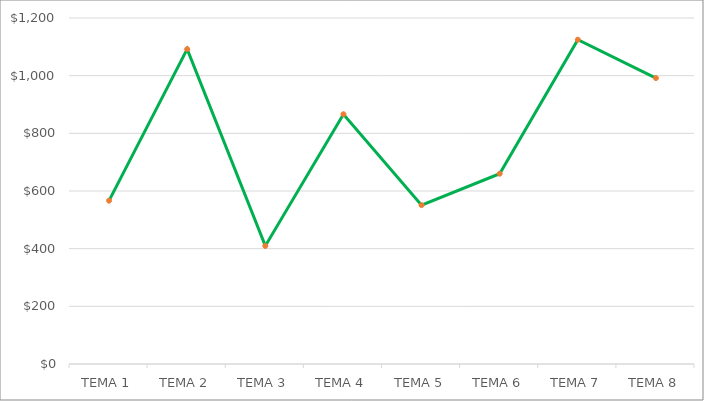
| Category | Series 1 |
|---|---|
| TEMA 1 | 566.475 |
| TEMA 2 | 1092.065 |
| TEMA 3 | 409.5 |
| TEMA 4 | 866.25 |
| TEMA 5 | 551 |
| TEMA 6 | 660 |
| TEMA 7 | 1124.75 |
| TEMA 8 | 991.76 |